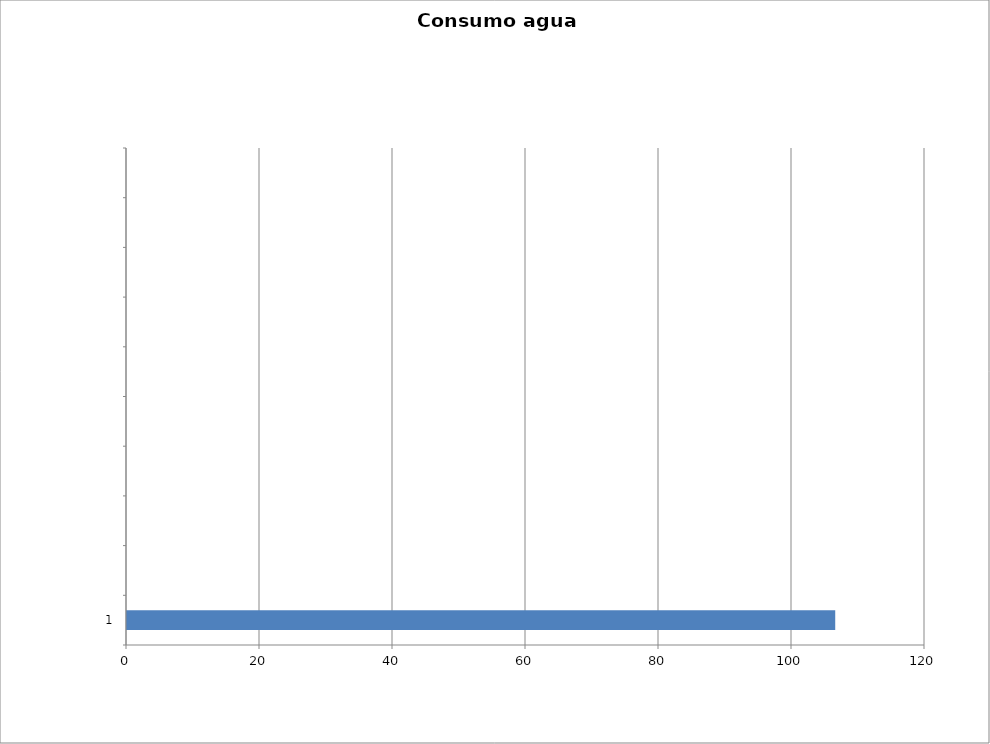
| Category | Series 0 |
|---|---|
| 1 | 106.5 |